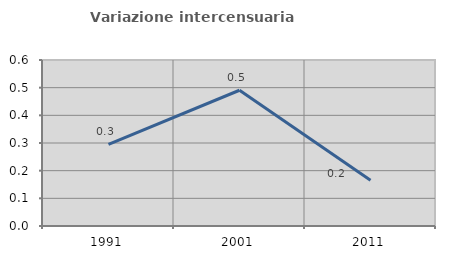
| Category | Variazione intercensuaria annua |
|---|---|
| 1991.0 | 0.295 |
| 2001.0 | 0.491 |
| 2011.0 | 0.165 |